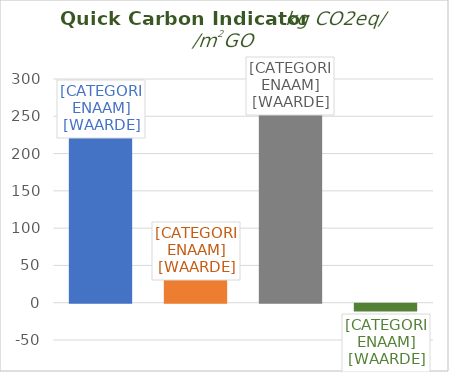
| Category | Materiaal |
|---|---|
| materiaal | 221.667 |
| energie | 32.044 |
| mat+ene | 253.711 |
| biogeen | -10.387 |